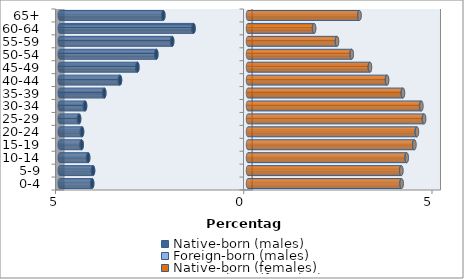
| Category | Native-born (males) | Foreign-born (males) | Native-born (females) | Foreign-born (females) |
|---|---|---|---|---|
| 0-4 | -4.139 | -0.005 | 4.077 | 0.004 |
| 5-9 | -4.115 | -0.006 | 4.069 | 0.004 |
| 10-14 | -4.245 | -0.008 | 4.211 | 0.006 |
| 15-19 | -4.418 | -0.009 | 4.413 | 0.008 |
| 20-24 | -4.407 | -0.01 | 4.479 | 0.009 |
| 25-29 | -4.485 | -0.011 | 4.67 | 0.01 |
| 30-34 | -4.327 | -0.01 | 4.596 | 0.01 |
| 35-39 | -3.817 | -0.009 | 4.11 | 0.009 |
| 40-44 | -3.399 | -0.008 | 3.689 | 0.008 |
| 45-49 | -2.937 | -0.007 | 3.235 | 0.006 |
| 50-54 | -2.435 | -0.006 | 2.75 | 0.005 |
| 55-59 | -2.014 | -0.005 | 2.361 | 0.004 |
| 60-64 | -1.447 | -0.004 | 1.753 | 0.004 |
| 65+ | -2.249 | -0.004 | 2.958 | 0.005 |